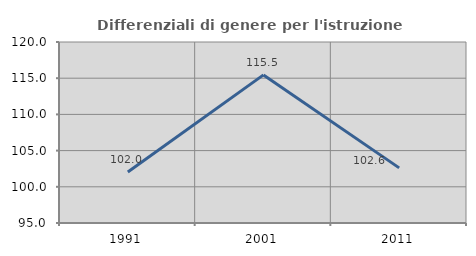
| Category | Differenziali di genere per l'istruzione superiore |
|---|---|
| 1991.0 | 102.045 |
| 2001.0 | 115.456 |
| 2011.0 | 102.613 |